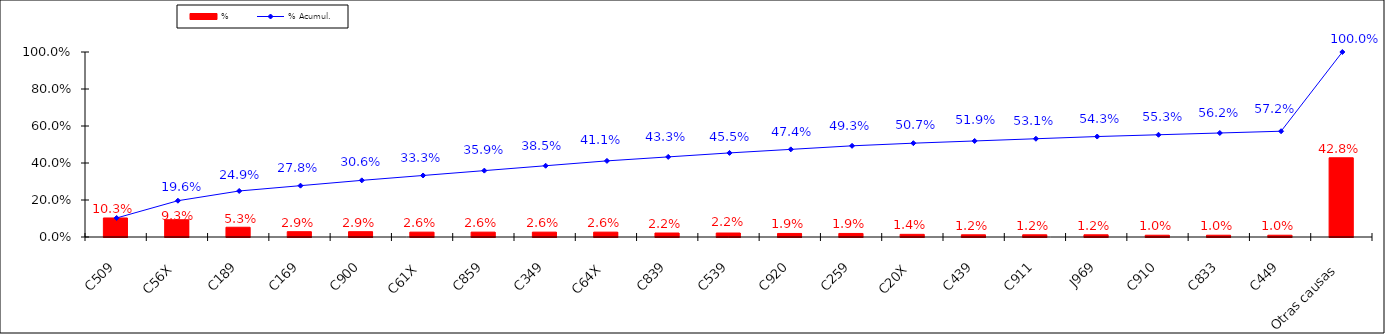
| Category | % |
|---|---|
| C509 | 0.103 |
| C56X | 0.093 |
| C189 | 0.053 |
| C169 | 0.029 |
| C900 | 0.029 |
| C61X | 0.026 |
| C859 | 0.026 |
| C349 | 0.026 |
| C64X | 0.026 |
| C839 | 0.022 |
| C539 | 0.022 |
| C920 | 0.019 |
| C259 | 0.019 |
| C20X | 0.014 |
| C439 | 0.012 |
| C911 | 0.012 |
| J969 | 0.012 |
| C910 | 0.01 |
| C833 | 0.01 |
| C449 | 0.01 |
| Otras causas | 0.428 |